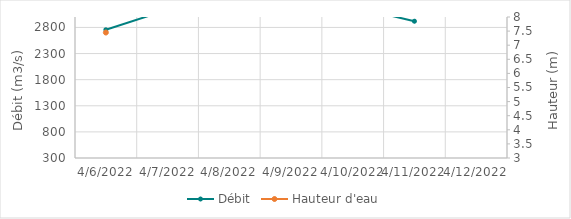
| Category | Débit |
|---|---|
| 2/23/22 | 1432.57 |
| 2/22/22 | 1585.46 |
| 2/21/22 | 1674.67 |
| 2/20/22 | 1756.03 |
| 2/19/22 | 1761.23 |
| 2/18/22 | 1685.12 |
| 2/17/22 | 1607 |